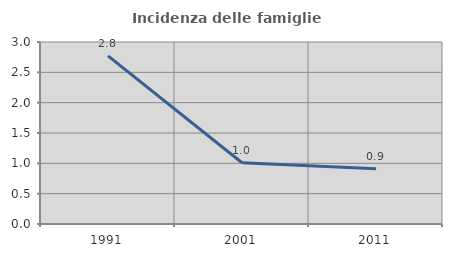
| Category | Incidenza delle famiglie numerose |
|---|---|
| 1991.0 | 2.77 |
| 2001.0 | 1.01 |
| 2011.0 | 0.911 |